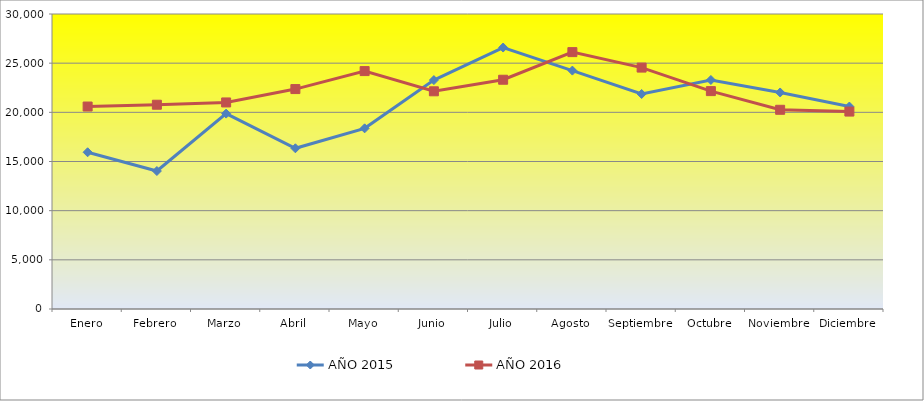
| Category | AÑO 2015 | AÑO 2016 |
|---|---|---|
| Enero | 15940 | 20590 |
| Febrero | 14031 | 20773 |
| Marzo | 19871 | 21005 |
| Abril | 16344 | 22365 |
| Mayo | 18371 | 24195 |
| Junio | 23278 | 22138 |
| Julio | 26590 | 23315 |
| Agosto | 24244 | 26124 |
| Septiembre | 21865 | 24551 |
| Octubre | 23290 | 22157 |
| Noviembre | 22019 | 20258 |
| Diciembre | 20587 | 20078 |